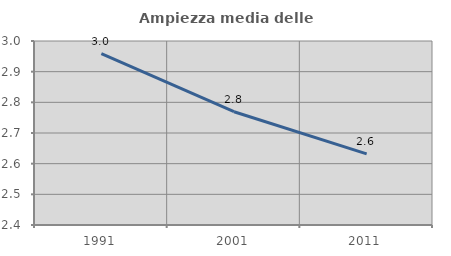
| Category | Ampiezza media delle famiglie |
|---|---|
| 1991.0 | 2.959 |
| 2001.0 | 2.769 |
| 2011.0 | 2.632 |